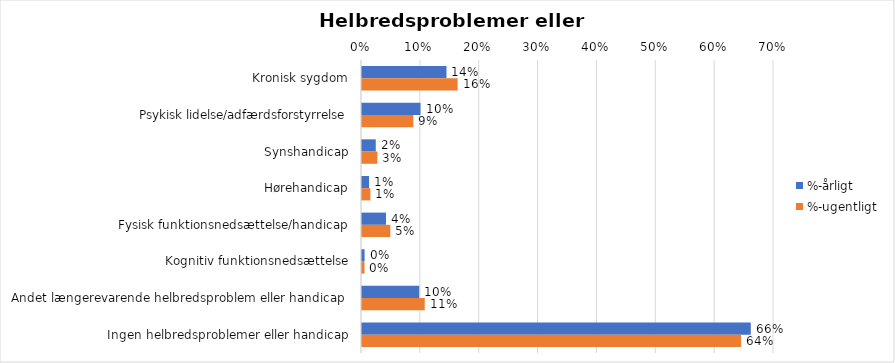
| Category | %-årligt | %-ugentligt |
|---|---|---|
| Kronisk sygdom | 0.144 | 0.162 |
| Psykisk lidelse/adfærdsforstyrrelse | 0.099 | 0.087 |
| Synshandicap | 0.023 | 0.026 |
| Hørehandicap | 0.012 | 0.014 |
| Fysisk funktionsnedsættelse/handicap | 0.041 | 0.048 |
| Kognitiv funktionsnedsættelse | 0.004 | 0.004 |
| Andet længerevarende helbredsproblem eller handicap  | 0.097 | 0.107 |
| Ingen helbredsproblemer eller handicap | 0.661 | 0.644 |